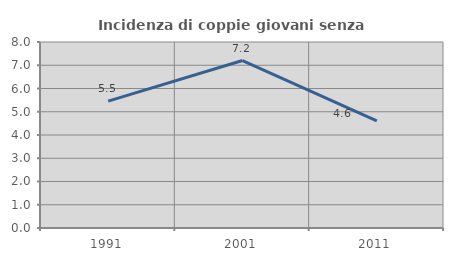
| Category | Incidenza di coppie giovani senza figli |
|---|---|
| 1991.0 | 5.455 |
| 2001.0 | 7.203 |
| 2011.0 | 4.61 |